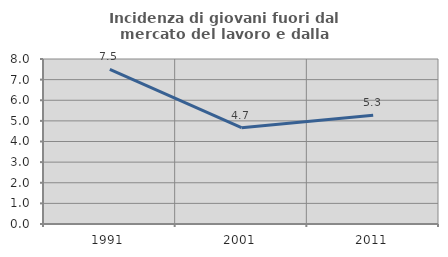
| Category | Incidenza di giovani fuori dal mercato del lavoro e dalla formazione  |
|---|---|
| 1991.0 | 7.495 |
| 2001.0 | 4.672 |
| 2011.0 | 5.271 |